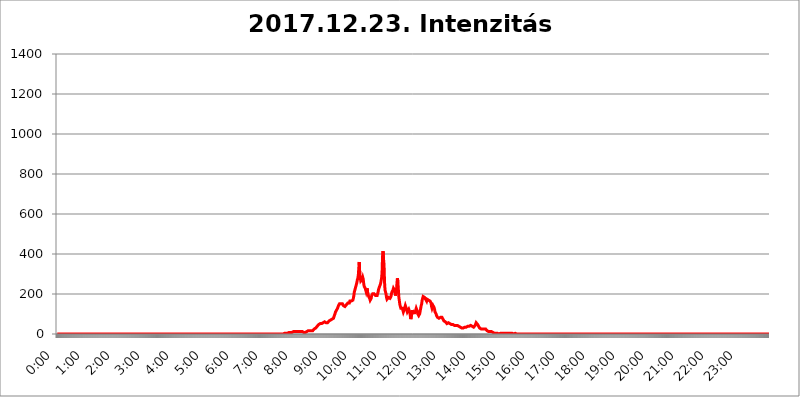
| Category | 2017.12.23. Intenzitás [W/m^2] |
|---|---|
| 0.0 | 0 |
| 0.0006944444444444445 | 0 |
| 0.001388888888888889 | 0 |
| 0.0020833333333333333 | 0 |
| 0.002777777777777778 | 0 |
| 0.003472222222222222 | 0 |
| 0.004166666666666667 | 0 |
| 0.004861111111111111 | 0 |
| 0.005555555555555556 | 0 |
| 0.0062499999999999995 | 0 |
| 0.006944444444444444 | 0 |
| 0.007638888888888889 | 0 |
| 0.008333333333333333 | 0 |
| 0.009027777777777779 | 0 |
| 0.009722222222222222 | 0 |
| 0.010416666666666666 | 0 |
| 0.011111111111111112 | 0 |
| 0.011805555555555555 | 0 |
| 0.012499999999999999 | 0 |
| 0.013194444444444444 | 0 |
| 0.013888888888888888 | 0 |
| 0.014583333333333332 | 0 |
| 0.015277777777777777 | 0 |
| 0.015972222222222224 | 0 |
| 0.016666666666666666 | 0 |
| 0.017361111111111112 | 0 |
| 0.018055555555555557 | 0 |
| 0.01875 | 0 |
| 0.019444444444444445 | 0 |
| 0.02013888888888889 | 0 |
| 0.020833333333333332 | 0 |
| 0.02152777777777778 | 0 |
| 0.022222222222222223 | 0 |
| 0.02291666666666667 | 0 |
| 0.02361111111111111 | 0 |
| 0.024305555555555556 | 0 |
| 0.024999999999999998 | 0 |
| 0.025694444444444447 | 0 |
| 0.02638888888888889 | 0 |
| 0.027083333333333334 | 0 |
| 0.027777777777777776 | 0 |
| 0.02847222222222222 | 0 |
| 0.029166666666666664 | 0 |
| 0.029861111111111113 | 0 |
| 0.030555555555555555 | 0 |
| 0.03125 | 0 |
| 0.03194444444444445 | 0 |
| 0.03263888888888889 | 0 |
| 0.03333333333333333 | 0 |
| 0.034027777777777775 | 0 |
| 0.034722222222222224 | 0 |
| 0.035416666666666666 | 0 |
| 0.036111111111111115 | 0 |
| 0.03680555555555556 | 0 |
| 0.0375 | 0 |
| 0.03819444444444444 | 0 |
| 0.03888888888888889 | 0 |
| 0.03958333333333333 | 0 |
| 0.04027777777777778 | 0 |
| 0.04097222222222222 | 0 |
| 0.041666666666666664 | 0 |
| 0.042361111111111106 | 0 |
| 0.04305555555555556 | 0 |
| 0.043750000000000004 | 0 |
| 0.044444444444444446 | 0 |
| 0.04513888888888889 | 0 |
| 0.04583333333333334 | 0 |
| 0.04652777777777778 | 0 |
| 0.04722222222222222 | 0 |
| 0.04791666666666666 | 0 |
| 0.04861111111111111 | 0 |
| 0.049305555555555554 | 0 |
| 0.049999999999999996 | 0 |
| 0.05069444444444445 | 0 |
| 0.051388888888888894 | 0 |
| 0.052083333333333336 | 0 |
| 0.05277777777777778 | 0 |
| 0.05347222222222222 | 0 |
| 0.05416666666666667 | 0 |
| 0.05486111111111111 | 0 |
| 0.05555555555555555 | 0 |
| 0.05625 | 0 |
| 0.05694444444444444 | 0 |
| 0.057638888888888885 | 0 |
| 0.05833333333333333 | 0 |
| 0.05902777777777778 | 0 |
| 0.059722222222222225 | 0 |
| 0.06041666666666667 | 0 |
| 0.061111111111111116 | 0 |
| 0.06180555555555556 | 0 |
| 0.0625 | 0 |
| 0.06319444444444444 | 0 |
| 0.06388888888888888 | 0 |
| 0.06458333333333334 | 0 |
| 0.06527777777777778 | 0 |
| 0.06597222222222222 | 0 |
| 0.06666666666666667 | 0 |
| 0.06736111111111111 | 0 |
| 0.06805555555555555 | 0 |
| 0.06874999999999999 | 0 |
| 0.06944444444444443 | 0 |
| 0.07013888888888889 | 0 |
| 0.07083333333333333 | 0 |
| 0.07152777777777779 | 0 |
| 0.07222222222222223 | 0 |
| 0.07291666666666667 | 0 |
| 0.07361111111111111 | 0 |
| 0.07430555555555556 | 0 |
| 0.075 | 0 |
| 0.07569444444444444 | 0 |
| 0.0763888888888889 | 0 |
| 0.07708333333333334 | 0 |
| 0.07777777777777778 | 0 |
| 0.07847222222222222 | 0 |
| 0.07916666666666666 | 0 |
| 0.0798611111111111 | 0 |
| 0.08055555555555556 | 0 |
| 0.08125 | 0 |
| 0.08194444444444444 | 0 |
| 0.08263888888888889 | 0 |
| 0.08333333333333333 | 0 |
| 0.08402777777777777 | 0 |
| 0.08472222222222221 | 0 |
| 0.08541666666666665 | 0 |
| 0.08611111111111112 | 0 |
| 0.08680555555555557 | 0 |
| 0.08750000000000001 | 0 |
| 0.08819444444444445 | 0 |
| 0.08888888888888889 | 0 |
| 0.08958333333333333 | 0 |
| 0.09027777777777778 | 0 |
| 0.09097222222222222 | 0 |
| 0.09166666666666667 | 0 |
| 0.09236111111111112 | 0 |
| 0.09305555555555556 | 0 |
| 0.09375 | 0 |
| 0.09444444444444444 | 0 |
| 0.09513888888888888 | 0 |
| 0.09583333333333333 | 0 |
| 0.09652777777777777 | 0 |
| 0.09722222222222222 | 0 |
| 0.09791666666666667 | 0 |
| 0.09861111111111111 | 0 |
| 0.09930555555555555 | 0 |
| 0.09999999999999999 | 0 |
| 0.10069444444444443 | 0 |
| 0.1013888888888889 | 0 |
| 0.10208333333333335 | 0 |
| 0.10277777777777779 | 0 |
| 0.10347222222222223 | 0 |
| 0.10416666666666667 | 0 |
| 0.10486111111111111 | 0 |
| 0.10555555555555556 | 0 |
| 0.10625 | 0 |
| 0.10694444444444444 | 0 |
| 0.1076388888888889 | 0 |
| 0.10833333333333334 | 0 |
| 0.10902777777777778 | 0 |
| 0.10972222222222222 | 0 |
| 0.1111111111111111 | 0 |
| 0.11180555555555556 | 0 |
| 0.11180555555555556 | 0 |
| 0.1125 | 0 |
| 0.11319444444444444 | 0 |
| 0.11388888888888889 | 0 |
| 0.11458333333333333 | 0 |
| 0.11527777777777777 | 0 |
| 0.11597222222222221 | 0 |
| 0.11666666666666665 | 0 |
| 0.1173611111111111 | 0 |
| 0.11805555555555557 | 0 |
| 0.11944444444444445 | 0 |
| 0.12013888888888889 | 0 |
| 0.12083333333333333 | 0 |
| 0.12152777777777778 | 0 |
| 0.12222222222222223 | 0 |
| 0.12291666666666667 | 0 |
| 0.12291666666666667 | 0 |
| 0.12361111111111112 | 0 |
| 0.12430555555555556 | 0 |
| 0.125 | 0 |
| 0.12569444444444444 | 0 |
| 0.12638888888888888 | 0 |
| 0.12708333333333333 | 0 |
| 0.16875 | 0 |
| 0.12847222222222224 | 0 |
| 0.12916666666666668 | 0 |
| 0.12986111111111112 | 0 |
| 0.13055555555555556 | 0 |
| 0.13125 | 0 |
| 0.13194444444444445 | 0 |
| 0.1326388888888889 | 0 |
| 0.13333333333333333 | 0 |
| 0.13402777777777777 | 0 |
| 0.13402777777777777 | 0 |
| 0.13472222222222222 | 0 |
| 0.13541666666666666 | 0 |
| 0.1361111111111111 | 0 |
| 0.13749999999999998 | 0 |
| 0.13819444444444443 | 0 |
| 0.1388888888888889 | 0 |
| 0.13958333333333334 | 0 |
| 0.14027777777777778 | 0 |
| 0.14097222222222222 | 0 |
| 0.14166666666666666 | 0 |
| 0.1423611111111111 | 0 |
| 0.14305555555555557 | 0 |
| 0.14375000000000002 | 0 |
| 0.14444444444444446 | 0 |
| 0.1451388888888889 | 0 |
| 0.1451388888888889 | 0 |
| 0.14652777777777778 | 0 |
| 0.14722222222222223 | 0 |
| 0.14791666666666667 | 0 |
| 0.1486111111111111 | 0 |
| 0.14930555555555555 | 0 |
| 0.15 | 0 |
| 0.15069444444444444 | 0 |
| 0.15138888888888888 | 0 |
| 0.15208333333333332 | 0 |
| 0.15277777777777776 | 0 |
| 0.15347222222222223 | 0 |
| 0.15416666666666667 | 0 |
| 0.15486111111111112 | 0 |
| 0.15555555555555556 | 0 |
| 0.15625 | 0 |
| 0.15694444444444444 | 0 |
| 0.15763888888888888 | 0 |
| 0.15833333333333333 | 0 |
| 0.15902777777777777 | 0 |
| 0.15972222222222224 | 0 |
| 0.16041666666666668 | 0 |
| 0.16111111111111112 | 0 |
| 0.16180555555555556 | 0 |
| 0.1625 | 0 |
| 0.16319444444444445 | 0 |
| 0.1638888888888889 | 0 |
| 0.16458333333333333 | 0 |
| 0.16527777777777777 | 0 |
| 0.16597222222222222 | 0 |
| 0.16666666666666666 | 0 |
| 0.1673611111111111 | 0 |
| 0.16805555555555554 | 0 |
| 0.16874999999999998 | 0 |
| 0.16944444444444443 | 0 |
| 0.17013888888888887 | 0 |
| 0.1708333333333333 | 0 |
| 0.17152777777777775 | 0 |
| 0.17222222222222225 | 0 |
| 0.1729166666666667 | 0 |
| 0.17361111111111113 | 0 |
| 0.17430555555555557 | 0 |
| 0.17500000000000002 | 0 |
| 0.17569444444444446 | 0 |
| 0.1763888888888889 | 0 |
| 0.17708333333333334 | 0 |
| 0.17777777777777778 | 0 |
| 0.17847222222222223 | 0 |
| 0.17916666666666667 | 0 |
| 0.1798611111111111 | 0 |
| 0.18055555555555555 | 0 |
| 0.18125 | 0 |
| 0.18194444444444444 | 0 |
| 0.1826388888888889 | 0 |
| 0.18333333333333335 | 0 |
| 0.1840277777777778 | 0 |
| 0.18472222222222223 | 0 |
| 0.18541666666666667 | 0 |
| 0.18611111111111112 | 0 |
| 0.18680555555555556 | 0 |
| 0.1875 | 0 |
| 0.18819444444444444 | 0 |
| 0.18888888888888888 | 0 |
| 0.18958333333333333 | 0 |
| 0.19027777777777777 | 0 |
| 0.1909722222222222 | 0 |
| 0.19166666666666665 | 0 |
| 0.19236111111111112 | 0 |
| 0.19305555555555554 | 0 |
| 0.19375 | 0 |
| 0.19444444444444445 | 0 |
| 0.1951388888888889 | 0 |
| 0.19583333333333333 | 0 |
| 0.19652777777777777 | 0 |
| 0.19722222222222222 | 0 |
| 0.19791666666666666 | 0 |
| 0.1986111111111111 | 0 |
| 0.19930555555555554 | 0 |
| 0.19999999999999998 | 0 |
| 0.20069444444444443 | 0 |
| 0.20138888888888887 | 0 |
| 0.2020833333333333 | 0 |
| 0.2027777777777778 | 0 |
| 0.2034722222222222 | 0 |
| 0.2041666666666667 | 0 |
| 0.20486111111111113 | 0 |
| 0.20555555555555557 | 0 |
| 0.20625000000000002 | 0 |
| 0.20694444444444446 | 0 |
| 0.2076388888888889 | 0 |
| 0.20833333333333334 | 0 |
| 0.20902777777777778 | 0 |
| 0.20972222222222223 | 0 |
| 0.21041666666666667 | 0 |
| 0.2111111111111111 | 0 |
| 0.21180555555555555 | 0 |
| 0.2125 | 0 |
| 0.21319444444444444 | 0 |
| 0.2138888888888889 | 0 |
| 0.21458333333333335 | 0 |
| 0.2152777777777778 | 0 |
| 0.21597222222222223 | 0 |
| 0.21666666666666667 | 0 |
| 0.21736111111111112 | 0 |
| 0.21805555555555556 | 0 |
| 0.21875 | 0 |
| 0.21944444444444444 | 0 |
| 0.22013888888888888 | 0 |
| 0.22083333333333333 | 0 |
| 0.22152777777777777 | 0 |
| 0.2222222222222222 | 0 |
| 0.22291666666666665 | 0 |
| 0.2236111111111111 | 0 |
| 0.22430555555555556 | 0 |
| 0.225 | 0 |
| 0.22569444444444445 | 0 |
| 0.2263888888888889 | 0 |
| 0.22708333333333333 | 0 |
| 0.22777777777777777 | 0 |
| 0.22847222222222222 | 0 |
| 0.22916666666666666 | 0 |
| 0.2298611111111111 | 0 |
| 0.23055555555555554 | 0 |
| 0.23124999999999998 | 0 |
| 0.23194444444444443 | 0 |
| 0.23263888888888887 | 0 |
| 0.2333333333333333 | 0 |
| 0.2340277777777778 | 0 |
| 0.2347222222222222 | 0 |
| 0.2354166666666667 | 0 |
| 0.23611111111111113 | 0 |
| 0.23680555555555557 | 0 |
| 0.23750000000000002 | 0 |
| 0.23819444444444446 | 0 |
| 0.2388888888888889 | 0 |
| 0.23958333333333334 | 0 |
| 0.24027777777777778 | 0 |
| 0.24097222222222223 | 0 |
| 0.24166666666666667 | 0 |
| 0.2423611111111111 | 0 |
| 0.24305555555555555 | 0 |
| 0.24375 | 0 |
| 0.24444444444444446 | 0 |
| 0.24513888888888888 | 0 |
| 0.24583333333333335 | 0 |
| 0.2465277777777778 | 0 |
| 0.24722222222222223 | 0 |
| 0.24791666666666667 | 0 |
| 0.24861111111111112 | 0 |
| 0.24930555555555556 | 0 |
| 0.25 | 0 |
| 0.25069444444444444 | 0 |
| 0.2513888888888889 | 0 |
| 0.2520833333333333 | 0 |
| 0.25277777777777777 | 0 |
| 0.2534722222222222 | 0 |
| 0.25416666666666665 | 0 |
| 0.2548611111111111 | 0 |
| 0.2555555555555556 | 0 |
| 0.25625000000000003 | 0 |
| 0.2569444444444445 | 0 |
| 0.2576388888888889 | 0 |
| 0.25833333333333336 | 0 |
| 0.2590277777777778 | 0 |
| 0.25972222222222224 | 0 |
| 0.2604166666666667 | 0 |
| 0.2611111111111111 | 0 |
| 0.26180555555555557 | 0 |
| 0.2625 | 0 |
| 0.26319444444444445 | 0 |
| 0.2638888888888889 | 0 |
| 0.26458333333333334 | 0 |
| 0.2652777777777778 | 0 |
| 0.2659722222222222 | 0 |
| 0.26666666666666666 | 0 |
| 0.2673611111111111 | 0 |
| 0.26805555555555555 | 0 |
| 0.26875 | 0 |
| 0.26944444444444443 | 0 |
| 0.2701388888888889 | 0 |
| 0.2708333333333333 | 0 |
| 0.27152777777777776 | 0 |
| 0.2722222222222222 | 0 |
| 0.27291666666666664 | 0 |
| 0.2736111111111111 | 0 |
| 0.2743055555555555 | 0 |
| 0.27499999999999997 | 0 |
| 0.27569444444444446 | 0 |
| 0.27638888888888885 | 0 |
| 0.27708333333333335 | 0 |
| 0.2777777777777778 | 0 |
| 0.27847222222222223 | 0 |
| 0.2791666666666667 | 0 |
| 0.2798611111111111 | 0 |
| 0.28055555555555556 | 0 |
| 0.28125 | 0 |
| 0.28194444444444444 | 0 |
| 0.2826388888888889 | 0 |
| 0.2833333333333333 | 0 |
| 0.28402777777777777 | 0 |
| 0.2847222222222222 | 0 |
| 0.28541666666666665 | 0 |
| 0.28611111111111115 | 0 |
| 0.28680555555555554 | 0 |
| 0.28750000000000003 | 0 |
| 0.2881944444444445 | 0 |
| 0.2888888888888889 | 0 |
| 0.28958333333333336 | 0 |
| 0.2902777777777778 | 0 |
| 0.29097222222222224 | 0 |
| 0.2916666666666667 | 0 |
| 0.2923611111111111 | 0 |
| 0.29305555555555557 | 0 |
| 0.29375 | 0 |
| 0.29444444444444445 | 0 |
| 0.2951388888888889 | 0 |
| 0.29583333333333334 | 0 |
| 0.2965277777777778 | 0 |
| 0.2972222222222222 | 0 |
| 0.29791666666666666 | 0 |
| 0.2986111111111111 | 0 |
| 0.29930555555555555 | 0 |
| 0.3 | 0 |
| 0.30069444444444443 | 0 |
| 0.3013888888888889 | 0 |
| 0.3020833333333333 | 0 |
| 0.30277777777777776 | 0 |
| 0.3034722222222222 | 0 |
| 0.30416666666666664 | 0 |
| 0.3048611111111111 | 0 |
| 0.3055555555555555 | 0 |
| 0.30624999999999997 | 0 |
| 0.3069444444444444 | 0 |
| 0.3076388888888889 | 0 |
| 0.30833333333333335 | 0 |
| 0.3090277777777778 | 0 |
| 0.30972222222222223 | 0 |
| 0.3104166666666667 | 0 |
| 0.3111111111111111 | 0 |
| 0.31180555555555556 | 0 |
| 0.3125 | 0 |
| 0.31319444444444444 | 0 |
| 0.3138888888888889 | 0 |
| 0.3145833333333333 | 0 |
| 0.31527777777777777 | 0 |
| 0.3159722222222222 | 0 |
| 0.31666666666666665 | 0 |
| 0.31736111111111115 | 0 |
| 0.31805555555555554 | 0 |
| 0.31875000000000003 | 3.525 |
| 0.3194444444444445 | 3.525 |
| 0.3201388888888889 | 3.525 |
| 0.32083333333333336 | 3.525 |
| 0.3215277777777778 | 3.525 |
| 0.32222222222222224 | 3.525 |
| 0.3229166666666667 | 3.525 |
| 0.3236111111111111 | 3.525 |
| 0.32430555555555557 | 3.525 |
| 0.325 | 7.887 |
| 0.32569444444444445 | 7.887 |
| 0.3263888888888889 | 7.887 |
| 0.32708333333333334 | 7.887 |
| 0.3277777777777778 | 7.887 |
| 0.3284722222222222 | 7.887 |
| 0.32916666666666666 | 7.887 |
| 0.3298611111111111 | 12.257 |
| 0.33055555555555555 | 12.257 |
| 0.33125 | 12.257 |
| 0.33194444444444443 | 12.257 |
| 0.3326388888888889 | 12.257 |
| 0.3333333333333333 | 12.257 |
| 0.3340277777777778 | 12.257 |
| 0.3347222222222222 | 12.257 |
| 0.3354166666666667 | 12.257 |
| 0.3361111111111111 | 7.887 |
| 0.3368055555555556 | 7.887 |
| 0.33749999999999997 | 12.257 |
| 0.33819444444444446 | 12.257 |
| 0.33888888888888885 | 12.257 |
| 0.33958333333333335 | 12.257 |
| 0.34027777777777773 | 12.257 |
| 0.34097222222222223 | 12.257 |
| 0.3416666666666666 | 12.257 |
| 0.3423611111111111 | 12.257 |
| 0.3430555555555555 | 12.257 |
| 0.34375 | 12.257 |
| 0.3444444444444445 | 12.257 |
| 0.3451388888888889 | 7.887 |
| 0.3458333333333334 | 7.887 |
| 0.34652777777777777 | 12.257 |
| 0.34722222222222227 | 12.257 |
| 0.34791666666666665 | 7.887 |
| 0.34861111111111115 | 7.887 |
| 0.34930555555555554 | 12.257 |
| 0.35000000000000003 | 12.257 |
| 0.3506944444444444 | 12.257 |
| 0.3513888888888889 | 12.257 |
| 0.3520833333333333 | 16.636 |
| 0.3527777777777778 | 16.636 |
| 0.3534722222222222 | 16.636 |
| 0.3541666666666667 | 16.636 |
| 0.3548611111111111 | 16.636 |
| 0.35555555555555557 | 16.636 |
| 0.35625 | 16.636 |
| 0.35694444444444445 | 16.636 |
| 0.3576388888888889 | 16.636 |
| 0.35833333333333334 | 16.636 |
| 0.3590277777777778 | 21.024 |
| 0.3597222222222222 | 21.024 |
| 0.36041666666666666 | 25.419 |
| 0.3611111111111111 | 25.419 |
| 0.36180555555555555 | 29.823 |
| 0.3625 | 29.823 |
| 0.36319444444444443 | 34.234 |
| 0.3638888888888889 | 34.234 |
| 0.3645833333333333 | 38.653 |
| 0.3652777777777778 | 38.653 |
| 0.3659722222222222 | 43.079 |
| 0.3666666666666667 | 47.511 |
| 0.3673611111111111 | 47.511 |
| 0.3680555555555556 | 51.951 |
| 0.36874999999999997 | 51.951 |
| 0.36944444444444446 | 51.951 |
| 0.37013888888888885 | 51.951 |
| 0.37083333333333335 | 51.951 |
| 0.37152777777777773 | 51.951 |
| 0.37222222222222223 | 51.951 |
| 0.3729166666666666 | 56.398 |
| 0.3736111111111111 | 56.398 |
| 0.3743055555555555 | 60.85 |
| 0.375 | 60.85 |
| 0.3756944444444445 | 60.85 |
| 0.3763888888888889 | 60.85 |
| 0.3770833333333334 | 56.398 |
| 0.37777777777777777 | 56.398 |
| 0.37847222222222227 | 51.951 |
| 0.37916666666666665 | 56.398 |
| 0.37986111111111115 | 56.398 |
| 0.38055555555555554 | 60.85 |
| 0.38125000000000003 | 65.31 |
| 0.3819444444444444 | 65.31 |
| 0.3826388888888889 | 69.775 |
| 0.3833333333333333 | 69.775 |
| 0.3840277777777778 | 69.775 |
| 0.3847222222222222 | 69.775 |
| 0.3854166666666667 | 74.246 |
| 0.3861111111111111 | 74.246 |
| 0.38680555555555557 | 74.246 |
| 0.3875 | 78.722 |
| 0.38819444444444445 | 87.692 |
| 0.3888888888888889 | 92.184 |
| 0.38958333333333334 | 101.184 |
| 0.3902777777777778 | 110.201 |
| 0.3909722222222222 | 114.716 |
| 0.39166666666666666 | 119.235 |
| 0.3923611111111111 | 123.758 |
| 0.39305555555555555 | 128.284 |
| 0.39375 | 132.814 |
| 0.39444444444444443 | 141.884 |
| 0.3951388888888889 | 146.423 |
| 0.3958333333333333 | 150.964 |
| 0.3965277777777778 | 150.964 |
| 0.3972222222222222 | 155.509 |
| 0.3979166666666667 | 150.964 |
| 0.3986111111111111 | 150.964 |
| 0.3993055555555556 | 155.509 |
| 0.39999999999999997 | 150.964 |
| 0.40069444444444446 | 146.423 |
| 0.40138888888888885 | 141.884 |
| 0.40208333333333335 | 141.884 |
| 0.40277777777777773 | 137.347 |
| 0.40347222222222223 | 137.347 |
| 0.4041666666666666 | 137.347 |
| 0.4048611111111111 | 137.347 |
| 0.4055555555555555 | 146.423 |
| 0.40625 | 150.964 |
| 0.4069444444444445 | 150.964 |
| 0.4076388888888889 | 155.509 |
| 0.4083333333333334 | 150.964 |
| 0.40902777777777777 | 150.964 |
| 0.40972222222222227 | 155.509 |
| 0.41041666666666665 | 164.605 |
| 0.41111111111111115 | 169.156 |
| 0.41180555555555554 | 169.156 |
| 0.41250000000000003 | 164.605 |
| 0.4131944444444444 | 160.056 |
| 0.4138888888888889 | 164.605 |
| 0.4145833333333333 | 169.156 |
| 0.4152777777777778 | 178.264 |
| 0.4159722222222222 | 191.937 |
| 0.4166666666666667 | 210.182 |
| 0.4173611111111111 | 219.309 |
| 0.41805555555555557 | 228.436 |
| 0.41875 | 237.564 |
| 0.41944444444444445 | 246.689 |
| 0.4201388888888889 | 255.813 |
| 0.42083333333333334 | 269.49 |
| 0.4215277777777778 | 278.603 |
| 0.4222222222222222 | 292.259 |
| 0.42291666666666666 | 328.584 |
| 0.4236111111111111 | 360.221 |
| 0.42430555555555555 | 296.808 |
| 0.425 | 278.603 |
| 0.42569444444444443 | 264.932 |
| 0.4263888888888889 | 260.373 |
| 0.4270833333333333 | 269.49 |
| 0.4277777777777778 | 274.047 |
| 0.4284722222222222 | 283.156 |
| 0.4291666666666667 | 274.047 |
| 0.4298611111111111 | 251.251 |
| 0.4305555555555556 | 237.564 |
| 0.43124999999999997 | 233 |
| 0.43194444444444446 | 228.436 |
| 0.43263888888888885 | 219.309 |
| 0.43333333333333335 | 210.182 |
| 0.43402777777777773 | 214.746 |
| 0.43472222222222223 | 228.436 |
| 0.4354166666666666 | 205.62 |
| 0.4361111111111111 | 196.497 |
| 0.4368055555555555 | 187.378 |
| 0.4375 | 182.82 |
| 0.4381944444444445 | 178.264 |
| 0.4388888888888889 | 169.156 |
| 0.4395833333333334 | 169.156 |
| 0.44027777777777777 | 178.264 |
| 0.44097222222222227 | 191.937 |
| 0.44166666666666665 | 196.497 |
| 0.44236111111111115 | 201.058 |
| 0.44305555555555554 | 201.058 |
| 0.44375000000000003 | 201.058 |
| 0.4444444444444444 | 201.058 |
| 0.4451388888888889 | 201.058 |
| 0.4458333333333333 | 196.497 |
| 0.4465277777777778 | 191.937 |
| 0.4472222222222222 | 191.937 |
| 0.4479166666666667 | 191.937 |
| 0.4486111111111111 | 191.937 |
| 0.44930555555555557 | 201.058 |
| 0.45 | 210.182 |
| 0.45069444444444445 | 223.873 |
| 0.4513888888888889 | 228.436 |
| 0.45208333333333334 | 237.564 |
| 0.4527777777777778 | 242.127 |
| 0.4534722222222222 | 251.251 |
| 0.45416666666666666 | 255.813 |
| 0.4548611111111111 | 278.603 |
| 0.45555555555555555 | 305.898 |
| 0.45625 | 387.202 |
| 0.45694444444444443 | 414.035 |
| 0.4576388888888889 | 373.729 |
| 0.4583333333333333 | 346.682 |
| 0.4590277777777778 | 260.373 |
| 0.4597222222222222 | 219.309 |
| 0.4604166666666667 | 210.182 |
| 0.4611111111111111 | 201.058 |
| 0.4618055555555556 | 182.82 |
| 0.46249999999999997 | 173.709 |
| 0.46319444444444446 | 169.156 |
| 0.46388888888888885 | 178.264 |
| 0.46458333333333335 | 182.82 |
| 0.46527777777777773 | 187.378 |
| 0.46597222222222223 | 182.82 |
| 0.4666666666666666 | 178.264 |
| 0.4673611111111111 | 182.82 |
| 0.4680555555555555 | 187.378 |
| 0.46875 | 201.058 |
| 0.4694444444444445 | 210.182 |
| 0.4701388888888889 | 214.746 |
| 0.4708333333333334 | 219.309 |
| 0.47152777777777777 | 228.436 |
| 0.47222222222222227 | 233 |
| 0.47291666666666665 | 233 |
| 0.47361111111111115 | 214.746 |
| 0.47430555555555554 | 191.937 |
| 0.47500000000000003 | 191.937 |
| 0.4756944444444444 | 214.746 |
| 0.4763888888888889 | 251.251 |
| 0.4770833333333333 | 278.603 |
| 0.4777777777777778 | 260.373 |
| 0.4784722222222222 | 219.309 |
| 0.4791666666666667 | 182.82 |
| 0.4798611111111111 | 164.605 |
| 0.48055555555555557 | 146.423 |
| 0.48125 | 137.347 |
| 0.48194444444444445 | 128.284 |
| 0.4826388888888889 | 128.284 |
| 0.48333333333333334 | 128.284 |
| 0.4840277777777778 | 128.284 |
| 0.4847222222222222 | 119.235 |
| 0.48541666666666666 | 110.201 |
| 0.4861111111111111 | 110.201 |
| 0.48680555555555555 | 123.758 |
| 0.4875 | 132.814 |
| 0.48819444444444443 | 141.884 |
| 0.4888888888888889 | 146.423 |
| 0.4895833333333333 | 137.347 |
| 0.4902777777777778 | 119.235 |
| 0.4909722222222222 | 110.201 |
| 0.4916666666666667 | 110.201 |
| 0.4923611111111111 | 114.716 |
| 0.4930555555555556 | 123.758 |
| 0.49374999999999997 | 123.758 |
| 0.49444444444444446 | 110.201 |
| 0.49513888888888885 | 92.184 |
| 0.49583333333333335 | 74.246 |
| 0.49652777777777773 | 74.246 |
| 0.49722222222222223 | 101.184 |
| 0.4979166666666666 | 119.235 |
| 0.4986111111111111 | 114.716 |
| 0.4993055555555555 | 105.69 |
| 0.5 | 101.184 |
| 0.5006944444444444 | 101.184 |
| 0.5013888888888889 | 105.69 |
| 0.5020833333333333 | 110.201 |
| 0.5027777777777778 | 119.235 |
| 0.5034722222222222 | 128.284 |
| 0.5041666666666667 | 128.284 |
| 0.5048611111111111 | 114.716 |
| 0.5055555555555555 | 101.184 |
| 0.50625 | 96.682 |
| 0.5069444444444444 | 92.184 |
| 0.5076388888888889 | 96.682 |
| 0.5083333333333333 | 101.184 |
| 0.5090277777777777 | 114.716 |
| 0.5097222222222222 | 128.284 |
| 0.5104166666666666 | 141.884 |
| 0.5111111111111112 | 150.964 |
| 0.5118055555555555 | 169.156 |
| 0.5125000000000001 | 178.264 |
| 0.5131944444444444 | 187.378 |
| 0.513888888888889 | 187.378 |
| 0.5145833333333333 | 187.378 |
| 0.5152777777777778 | 182.82 |
| 0.5159722222222222 | 187.378 |
| 0.5166666666666667 | 173.709 |
| 0.517361111111111 | 173.709 |
| 0.5180555555555556 | 164.605 |
| 0.5187499999999999 | 173.709 |
| 0.5194444444444445 | 178.264 |
| 0.5201388888888888 | 178.264 |
| 0.5208333333333334 | 169.156 |
| 0.5215277777777778 | 164.605 |
| 0.5222222222222223 | 164.605 |
| 0.5229166666666667 | 164.605 |
| 0.5236111111111111 | 164.605 |
| 0.5243055555555556 | 155.509 |
| 0.525 | 137.347 |
| 0.5256944444444445 | 128.284 |
| 0.5263888888888889 | 132.814 |
| 0.5270833333333333 | 141.884 |
| 0.5277777777777778 | 141.884 |
| 0.5284722222222222 | 132.814 |
| 0.5291666666666667 | 123.758 |
| 0.5298611111111111 | 110.201 |
| 0.5305555555555556 | 105.69 |
| 0.53125 | 101.184 |
| 0.5319444444444444 | 92.184 |
| 0.5326388888888889 | 87.692 |
| 0.5333333333333333 | 83.205 |
| 0.5340277777777778 | 78.722 |
| 0.5347222222222222 | 78.722 |
| 0.5354166666666667 | 78.722 |
| 0.5361111111111111 | 78.722 |
| 0.5368055555555555 | 83.205 |
| 0.5375 | 83.205 |
| 0.5381944444444444 | 83.205 |
| 0.5388888888888889 | 83.205 |
| 0.5395833333333333 | 83.205 |
| 0.5402777777777777 | 78.722 |
| 0.5409722222222222 | 74.246 |
| 0.5416666666666666 | 69.775 |
| 0.5423611111111112 | 65.31 |
| 0.5430555555555555 | 65.31 |
| 0.5437500000000001 | 65.31 |
| 0.5444444444444444 | 60.85 |
| 0.545138888888889 | 56.398 |
| 0.5458333333333333 | 56.398 |
| 0.5465277777777778 | 51.951 |
| 0.5472222222222222 | 51.951 |
| 0.5479166666666667 | 51.951 |
| 0.548611111111111 | 56.398 |
| 0.5493055555555556 | 56.398 |
| 0.5499999999999999 | 51.951 |
| 0.5506944444444445 | 51.951 |
| 0.5513888888888888 | 47.511 |
| 0.5520833333333334 | 47.511 |
| 0.5527777777777778 | 47.511 |
| 0.5534722222222223 | 43.079 |
| 0.5541666666666667 | 47.511 |
| 0.5548611111111111 | 47.511 |
| 0.5555555555555556 | 47.511 |
| 0.55625 | 43.079 |
| 0.5569444444444445 | 43.079 |
| 0.5576388888888889 | 43.079 |
| 0.5583333333333333 | 43.079 |
| 0.5590277777777778 | 43.079 |
| 0.5597222222222222 | 43.079 |
| 0.5604166666666667 | 43.079 |
| 0.5611111111111111 | 43.079 |
| 0.5618055555555556 | 38.653 |
| 0.5625 | 38.653 |
| 0.5631944444444444 | 38.653 |
| 0.5638888888888889 | 34.234 |
| 0.5645833333333333 | 34.234 |
| 0.5652777777777778 | 34.234 |
| 0.5659722222222222 | 29.823 |
| 0.5666666666666667 | 29.823 |
| 0.5673611111111111 | 29.823 |
| 0.5680555555555555 | 29.823 |
| 0.56875 | 29.823 |
| 0.5694444444444444 | 29.823 |
| 0.5701388888888889 | 29.823 |
| 0.5708333333333333 | 29.823 |
| 0.5715277777777777 | 34.234 |
| 0.5722222222222222 | 34.234 |
| 0.5729166666666666 | 34.234 |
| 0.5736111111111112 | 34.234 |
| 0.5743055555555555 | 38.653 |
| 0.5750000000000001 | 38.653 |
| 0.5756944444444444 | 38.653 |
| 0.576388888888889 | 38.653 |
| 0.5770833333333333 | 38.653 |
| 0.5777777777777778 | 38.653 |
| 0.5784722222222222 | 38.653 |
| 0.5791666666666667 | 38.653 |
| 0.579861111111111 | 43.079 |
| 0.5805555555555556 | 43.079 |
| 0.5812499999999999 | 38.653 |
| 0.5819444444444445 | 38.653 |
| 0.5826388888888888 | 38.653 |
| 0.5833333333333334 | 38.653 |
| 0.5840277777777778 | 34.234 |
| 0.5847222222222223 | 38.653 |
| 0.5854166666666667 | 34.234 |
| 0.5861111111111111 | 43.079 |
| 0.5868055555555556 | 47.511 |
| 0.5875 | 56.398 |
| 0.5881944444444445 | 56.398 |
| 0.5888888888888889 | 51.951 |
| 0.5895833333333333 | 47.511 |
| 0.5902777777777778 | 43.079 |
| 0.5909722222222222 | 38.653 |
| 0.5916666666666667 | 34.234 |
| 0.5923611111111111 | 29.823 |
| 0.5930555555555556 | 29.823 |
| 0.59375 | 29.823 |
| 0.5944444444444444 | 25.419 |
| 0.5951388888888889 | 25.419 |
| 0.5958333333333333 | 25.419 |
| 0.5965277777777778 | 25.419 |
| 0.5972222222222222 | 25.419 |
| 0.5979166666666667 | 25.419 |
| 0.5986111111111111 | 25.419 |
| 0.5993055555555555 | 25.419 |
| 0.6 | 25.419 |
| 0.6006944444444444 | 25.419 |
| 0.6013888888888889 | 25.419 |
| 0.6020833333333333 | 21.024 |
| 0.6027777777777777 | 16.636 |
| 0.6034722222222222 | 12.257 |
| 0.6041666666666666 | 12.257 |
| 0.6048611111111112 | 12.257 |
| 0.6055555555555555 | 12.257 |
| 0.6062500000000001 | 12.257 |
| 0.6069444444444444 | 12.257 |
| 0.607638888888889 | 12.257 |
| 0.6083333333333333 | 12.257 |
| 0.6090277777777778 | 12.257 |
| 0.6097222222222222 | 7.887 |
| 0.6104166666666667 | 7.887 |
| 0.611111111111111 | 7.887 |
| 0.6118055555555556 | 7.887 |
| 0.6124999999999999 | 7.887 |
| 0.6131944444444445 | 3.525 |
| 0.6138888888888888 | 3.525 |
| 0.6145833333333334 | 3.525 |
| 0.6152777777777778 | 3.525 |
| 0.6159722222222223 | 3.525 |
| 0.6166666666666667 | 0 |
| 0.6173611111111111 | 3.525 |
| 0.6180555555555556 | 0 |
| 0.61875 | 0 |
| 0.6194444444444445 | 0 |
| 0.6201388888888889 | 3.525 |
| 0.6208333333333333 | 3.525 |
| 0.6215277777777778 | 3.525 |
| 0.6222222222222222 | 3.525 |
| 0.6229166666666667 | 3.525 |
| 0.6236111111111111 | 3.525 |
| 0.6243055555555556 | 3.525 |
| 0.625 | 3.525 |
| 0.6256944444444444 | 3.525 |
| 0.6263888888888889 | 3.525 |
| 0.6270833333333333 | 3.525 |
| 0.6277777777777778 | 3.525 |
| 0.6284722222222222 | 3.525 |
| 0.6291666666666667 | 3.525 |
| 0.6298611111111111 | 3.525 |
| 0.6305555555555555 | 3.525 |
| 0.63125 | 3.525 |
| 0.6319444444444444 | 3.525 |
| 0.6326388888888889 | 3.525 |
| 0.6333333333333333 | 3.525 |
| 0.6340277777777777 | 3.525 |
| 0.6347222222222222 | 3.525 |
| 0.6354166666666666 | 3.525 |
| 0.6361111111111112 | 3.525 |
| 0.6368055555555555 | 3.525 |
| 0.6375000000000001 | 3.525 |
| 0.6381944444444444 | 3.525 |
| 0.638888888888889 | 3.525 |
| 0.6395833333333333 | 3.525 |
| 0.6402777777777778 | 0 |
| 0.6409722222222222 | 3.525 |
| 0.6416666666666667 | 3.525 |
| 0.642361111111111 | 3.525 |
| 0.6430555555555556 | 0 |
| 0.6437499999999999 | 0 |
| 0.6444444444444445 | 0 |
| 0.6451388888888888 | 0 |
| 0.6458333333333334 | 0 |
| 0.6465277777777778 | 0 |
| 0.6472222222222223 | 0 |
| 0.6479166666666667 | 0 |
| 0.6486111111111111 | 0 |
| 0.6493055555555556 | 0 |
| 0.65 | 0 |
| 0.6506944444444445 | 0 |
| 0.6513888888888889 | 0 |
| 0.6520833333333333 | 0 |
| 0.6527777777777778 | 0 |
| 0.6534722222222222 | 0 |
| 0.6541666666666667 | 0 |
| 0.6548611111111111 | 0 |
| 0.6555555555555556 | 0 |
| 0.65625 | 0 |
| 0.6569444444444444 | 0 |
| 0.6576388888888889 | 0 |
| 0.6583333333333333 | 0 |
| 0.6590277777777778 | 0 |
| 0.6597222222222222 | 0 |
| 0.6604166666666667 | 0 |
| 0.6611111111111111 | 0 |
| 0.6618055555555555 | 0 |
| 0.6625 | 0 |
| 0.6631944444444444 | 0 |
| 0.6638888888888889 | 0 |
| 0.6645833333333333 | 0 |
| 0.6652777777777777 | 0 |
| 0.6659722222222222 | 0 |
| 0.6666666666666666 | 0 |
| 0.6673611111111111 | 0 |
| 0.6680555555555556 | 0 |
| 0.6687500000000001 | 0 |
| 0.6694444444444444 | 0 |
| 0.6701388888888888 | 0 |
| 0.6708333333333334 | 0 |
| 0.6715277777777778 | 0 |
| 0.6722222222222222 | 0 |
| 0.6729166666666666 | 0 |
| 0.6736111111111112 | 0 |
| 0.6743055555555556 | 0 |
| 0.6749999999999999 | 0 |
| 0.6756944444444444 | 0 |
| 0.6763888888888889 | 0 |
| 0.6770833333333334 | 0 |
| 0.6777777777777777 | 0 |
| 0.6784722222222223 | 0 |
| 0.6791666666666667 | 0 |
| 0.6798611111111111 | 0 |
| 0.6805555555555555 | 0 |
| 0.68125 | 0 |
| 0.6819444444444445 | 0 |
| 0.6826388888888889 | 0 |
| 0.6833333333333332 | 0 |
| 0.6840277777777778 | 0 |
| 0.6847222222222222 | 0 |
| 0.6854166666666667 | 0 |
| 0.686111111111111 | 0 |
| 0.6868055555555556 | 0 |
| 0.6875 | 0 |
| 0.6881944444444444 | 0 |
| 0.688888888888889 | 0 |
| 0.6895833333333333 | 0 |
| 0.6902777777777778 | 0 |
| 0.6909722222222222 | 0 |
| 0.6916666666666668 | 0 |
| 0.6923611111111111 | 0 |
| 0.6930555555555555 | 0 |
| 0.69375 | 0 |
| 0.6944444444444445 | 0 |
| 0.6951388888888889 | 0 |
| 0.6958333333333333 | 0 |
| 0.6965277777777777 | 0 |
| 0.6972222222222223 | 0 |
| 0.6979166666666666 | 0 |
| 0.6986111111111111 | 0 |
| 0.6993055555555556 | 0 |
| 0.7000000000000001 | 0 |
| 0.7006944444444444 | 0 |
| 0.7013888888888888 | 0 |
| 0.7020833333333334 | 0 |
| 0.7027777777777778 | 0 |
| 0.7034722222222222 | 0 |
| 0.7041666666666666 | 0 |
| 0.7048611111111112 | 0 |
| 0.7055555555555556 | 0 |
| 0.7062499999999999 | 0 |
| 0.7069444444444444 | 0 |
| 0.7076388888888889 | 0 |
| 0.7083333333333334 | 0 |
| 0.7090277777777777 | 0 |
| 0.7097222222222223 | 0 |
| 0.7104166666666667 | 0 |
| 0.7111111111111111 | 0 |
| 0.7118055555555555 | 0 |
| 0.7125 | 0 |
| 0.7131944444444445 | 0 |
| 0.7138888888888889 | 0 |
| 0.7145833333333332 | 0 |
| 0.7152777777777778 | 0 |
| 0.7159722222222222 | 0 |
| 0.7166666666666667 | 0 |
| 0.717361111111111 | 0 |
| 0.7180555555555556 | 0 |
| 0.71875 | 0 |
| 0.7194444444444444 | 0 |
| 0.720138888888889 | 0 |
| 0.7208333333333333 | 0 |
| 0.7215277777777778 | 0 |
| 0.7222222222222222 | 0 |
| 0.7229166666666668 | 0 |
| 0.7236111111111111 | 0 |
| 0.7243055555555555 | 0 |
| 0.725 | 0 |
| 0.7256944444444445 | 0 |
| 0.7263888888888889 | 0 |
| 0.7270833333333333 | 0 |
| 0.7277777777777777 | 0 |
| 0.7284722222222223 | 0 |
| 0.7291666666666666 | 0 |
| 0.7298611111111111 | 0 |
| 0.7305555555555556 | 0 |
| 0.7312500000000001 | 0 |
| 0.7319444444444444 | 0 |
| 0.7326388888888888 | 0 |
| 0.7333333333333334 | 0 |
| 0.7340277777777778 | 0 |
| 0.7347222222222222 | 0 |
| 0.7354166666666666 | 0 |
| 0.7361111111111112 | 0 |
| 0.7368055555555556 | 0 |
| 0.7374999999999999 | 0 |
| 0.7381944444444444 | 0 |
| 0.7388888888888889 | 0 |
| 0.7395833333333334 | 0 |
| 0.7402777777777777 | 0 |
| 0.7409722222222223 | 0 |
| 0.7416666666666667 | 0 |
| 0.7423611111111111 | 0 |
| 0.7430555555555555 | 0 |
| 0.74375 | 0 |
| 0.7444444444444445 | 0 |
| 0.7451388888888889 | 0 |
| 0.7458333333333332 | 0 |
| 0.7465277777777778 | 0 |
| 0.7472222222222222 | 0 |
| 0.7479166666666667 | 0 |
| 0.748611111111111 | 0 |
| 0.7493055555555556 | 0 |
| 0.75 | 0 |
| 0.7506944444444444 | 0 |
| 0.751388888888889 | 0 |
| 0.7520833333333333 | 0 |
| 0.7527777777777778 | 0 |
| 0.7534722222222222 | 0 |
| 0.7541666666666668 | 0 |
| 0.7548611111111111 | 0 |
| 0.7555555555555555 | 0 |
| 0.75625 | 0 |
| 0.7569444444444445 | 0 |
| 0.7576388888888889 | 0 |
| 0.7583333333333333 | 0 |
| 0.7590277777777777 | 0 |
| 0.7597222222222223 | 0 |
| 0.7604166666666666 | 0 |
| 0.7611111111111111 | 0 |
| 0.7618055555555556 | 0 |
| 0.7625000000000001 | 0 |
| 0.7631944444444444 | 0 |
| 0.7638888888888888 | 0 |
| 0.7645833333333334 | 0 |
| 0.7652777777777778 | 0 |
| 0.7659722222222222 | 0 |
| 0.7666666666666666 | 0 |
| 0.7673611111111112 | 0 |
| 0.7680555555555556 | 0 |
| 0.7687499999999999 | 0 |
| 0.7694444444444444 | 0 |
| 0.7701388888888889 | 0 |
| 0.7708333333333334 | 0 |
| 0.7715277777777777 | 0 |
| 0.7722222222222223 | 0 |
| 0.7729166666666667 | 0 |
| 0.7736111111111111 | 0 |
| 0.7743055555555555 | 0 |
| 0.775 | 0 |
| 0.7756944444444445 | 0 |
| 0.7763888888888889 | 0 |
| 0.7770833333333332 | 0 |
| 0.7777777777777778 | 0 |
| 0.7784722222222222 | 0 |
| 0.7791666666666667 | 0 |
| 0.779861111111111 | 0 |
| 0.7805555555555556 | 0 |
| 0.78125 | 0 |
| 0.7819444444444444 | 0 |
| 0.782638888888889 | 0 |
| 0.7833333333333333 | 0 |
| 0.7840277777777778 | 0 |
| 0.7847222222222222 | 0 |
| 0.7854166666666668 | 0 |
| 0.7861111111111111 | 0 |
| 0.7868055555555555 | 0 |
| 0.7875 | 0 |
| 0.7881944444444445 | 0 |
| 0.7888888888888889 | 0 |
| 0.7895833333333333 | 0 |
| 0.7902777777777777 | 0 |
| 0.7909722222222223 | 0 |
| 0.7916666666666666 | 0 |
| 0.7923611111111111 | 0 |
| 0.7930555555555556 | 0 |
| 0.7937500000000001 | 0 |
| 0.7944444444444444 | 0 |
| 0.7951388888888888 | 0 |
| 0.7958333333333334 | 0 |
| 0.7965277777777778 | 0 |
| 0.7972222222222222 | 0 |
| 0.7979166666666666 | 0 |
| 0.7986111111111112 | 0 |
| 0.7993055555555556 | 0 |
| 0.7999999999999999 | 0 |
| 0.8006944444444444 | 0 |
| 0.8013888888888889 | 0 |
| 0.8020833333333334 | 0 |
| 0.8027777777777777 | 0 |
| 0.8034722222222223 | 0 |
| 0.8041666666666667 | 0 |
| 0.8048611111111111 | 0 |
| 0.8055555555555555 | 0 |
| 0.80625 | 0 |
| 0.8069444444444445 | 0 |
| 0.8076388888888889 | 0 |
| 0.8083333333333332 | 0 |
| 0.8090277777777778 | 0 |
| 0.8097222222222222 | 0 |
| 0.8104166666666667 | 0 |
| 0.811111111111111 | 0 |
| 0.8118055555555556 | 0 |
| 0.8125 | 0 |
| 0.8131944444444444 | 0 |
| 0.813888888888889 | 0 |
| 0.8145833333333333 | 0 |
| 0.8152777777777778 | 0 |
| 0.8159722222222222 | 0 |
| 0.8166666666666668 | 0 |
| 0.8173611111111111 | 0 |
| 0.8180555555555555 | 0 |
| 0.81875 | 0 |
| 0.8194444444444445 | 0 |
| 0.8201388888888889 | 0 |
| 0.8208333333333333 | 0 |
| 0.8215277777777777 | 0 |
| 0.8222222222222223 | 0 |
| 0.8229166666666666 | 0 |
| 0.8236111111111111 | 0 |
| 0.8243055555555556 | 0 |
| 0.8250000000000001 | 0 |
| 0.8256944444444444 | 0 |
| 0.8263888888888888 | 0 |
| 0.8270833333333334 | 0 |
| 0.8277777777777778 | 0 |
| 0.8284722222222222 | 0 |
| 0.8291666666666666 | 0 |
| 0.8298611111111112 | 0 |
| 0.8305555555555556 | 0 |
| 0.8312499999999999 | 0 |
| 0.8319444444444444 | 0 |
| 0.8326388888888889 | 0 |
| 0.8333333333333334 | 0 |
| 0.8340277777777777 | 0 |
| 0.8347222222222223 | 0 |
| 0.8354166666666667 | 0 |
| 0.8361111111111111 | 0 |
| 0.8368055555555555 | 0 |
| 0.8375 | 0 |
| 0.8381944444444445 | 0 |
| 0.8388888888888889 | 0 |
| 0.8395833333333332 | 0 |
| 0.8402777777777778 | 0 |
| 0.8409722222222222 | 0 |
| 0.8416666666666667 | 0 |
| 0.842361111111111 | 0 |
| 0.8430555555555556 | 0 |
| 0.84375 | 0 |
| 0.8444444444444444 | 0 |
| 0.845138888888889 | 0 |
| 0.8458333333333333 | 0 |
| 0.8465277777777778 | 0 |
| 0.8472222222222222 | 0 |
| 0.8479166666666668 | 0 |
| 0.8486111111111111 | 0 |
| 0.8493055555555555 | 0 |
| 0.85 | 0 |
| 0.8506944444444445 | 0 |
| 0.8513888888888889 | 0 |
| 0.8520833333333333 | 0 |
| 0.8527777777777777 | 0 |
| 0.8534722222222223 | 0 |
| 0.8541666666666666 | 0 |
| 0.8548611111111111 | 0 |
| 0.8555555555555556 | 0 |
| 0.8562500000000001 | 0 |
| 0.8569444444444444 | 0 |
| 0.8576388888888888 | 0 |
| 0.8583333333333334 | 0 |
| 0.8590277777777778 | 0 |
| 0.8597222222222222 | 0 |
| 0.8604166666666666 | 0 |
| 0.8611111111111112 | 0 |
| 0.8618055555555556 | 0 |
| 0.8624999999999999 | 0 |
| 0.8631944444444444 | 0 |
| 0.8638888888888889 | 0 |
| 0.8645833333333334 | 0 |
| 0.8652777777777777 | 0 |
| 0.8659722222222223 | 0 |
| 0.8666666666666667 | 0 |
| 0.8673611111111111 | 0 |
| 0.8680555555555555 | 0 |
| 0.86875 | 0 |
| 0.8694444444444445 | 0 |
| 0.8701388888888889 | 0 |
| 0.8708333333333332 | 0 |
| 0.8715277777777778 | 0 |
| 0.8722222222222222 | 0 |
| 0.8729166666666667 | 0 |
| 0.873611111111111 | 0 |
| 0.8743055555555556 | 0 |
| 0.875 | 0 |
| 0.8756944444444444 | 0 |
| 0.876388888888889 | 0 |
| 0.8770833333333333 | 0 |
| 0.8777777777777778 | 0 |
| 0.8784722222222222 | 0 |
| 0.8791666666666668 | 0 |
| 0.8798611111111111 | 0 |
| 0.8805555555555555 | 0 |
| 0.88125 | 0 |
| 0.8819444444444445 | 0 |
| 0.8826388888888889 | 0 |
| 0.8833333333333333 | 0 |
| 0.8840277777777777 | 0 |
| 0.8847222222222223 | 0 |
| 0.8854166666666666 | 0 |
| 0.8861111111111111 | 0 |
| 0.8868055555555556 | 0 |
| 0.8875000000000001 | 0 |
| 0.8881944444444444 | 0 |
| 0.8888888888888888 | 0 |
| 0.8895833333333334 | 0 |
| 0.8902777777777778 | 0 |
| 0.8909722222222222 | 0 |
| 0.8916666666666666 | 0 |
| 0.8923611111111112 | 0 |
| 0.8930555555555556 | 0 |
| 0.8937499999999999 | 0 |
| 0.8944444444444444 | 0 |
| 0.8951388888888889 | 0 |
| 0.8958333333333334 | 0 |
| 0.8965277777777777 | 0 |
| 0.8972222222222223 | 0 |
| 0.8979166666666667 | 0 |
| 0.8986111111111111 | 0 |
| 0.8993055555555555 | 0 |
| 0.9 | 0 |
| 0.9006944444444445 | 0 |
| 0.9013888888888889 | 0 |
| 0.9020833333333332 | 0 |
| 0.9027777777777778 | 0 |
| 0.9034722222222222 | 0 |
| 0.9041666666666667 | 0 |
| 0.904861111111111 | 0 |
| 0.9055555555555556 | 0 |
| 0.90625 | 0 |
| 0.9069444444444444 | 0 |
| 0.907638888888889 | 0 |
| 0.9083333333333333 | 0 |
| 0.9090277777777778 | 0 |
| 0.9097222222222222 | 0 |
| 0.9104166666666668 | 0 |
| 0.9111111111111111 | 0 |
| 0.9118055555555555 | 0 |
| 0.9125 | 0 |
| 0.9131944444444445 | 0 |
| 0.9138888888888889 | 0 |
| 0.9145833333333333 | 0 |
| 0.9152777777777777 | 0 |
| 0.9159722222222223 | 0 |
| 0.9166666666666666 | 0 |
| 0.9173611111111111 | 0 |
| 0.9180555555555556 | 0 |
| 0.9187500000000001 | 0 |
| 0.9194444444444444 | 0 |
| 0.9201388888888888 | 0 |
| 0.9208333333333334 | 0 |
| 0.9215277777777778 | 0 |
| 0.9222222222222222 | 0 |
| 0.9229166666666666 | 0 |
| 0.9236111111111112 | 0 |
| 0.9243055555555556 | 0 |
| 0.9249999999999999 | 0 |
| 0.9256944444444444 | 0 |
| 0.9263888888888889 | 0 |
| 0.9270833333333334 | 0 |
| 0.9277777777777777 | 0 |
| 0.9284722222222223 | 0 |
| 0.9291666666666667 | 0 |
| 0.9298611111111111 | 0 |
| 0.9305555555555555 | 0 |
| 0.93125 | 0 |
| 0.9319444444444445 | 0 |
| 0.9326388888888889 | 0 |
| 0.9333333333333332 | 0 |
| 0.9340277777777778 | 0 |
| 0.9347222222222222 | 0 |
| 0.9354166666666667 | 0 |
| 0.936111111111111 | 0 |
| 0.9368055555555556 | 0 |
| 0.9375 | 0 |
| 0.9381944444444444 | 0 |
| 0.938888888888889 | 0 |
| 0.9395833333333333 | 0 |
| 0.9402777777777778 | 0 |
| 0.9409722222222222 | 0 |
| 0.9416666666666668 | 0 |
| 0.9423611111111111 | 0 |
| 0.9430555555555555 | 0 |
| 0.94375 | 0 |
| 0.9444444444444445 | 0 |
| 0.9451388888888889 | 0 |
| 0.9458333333333333 | 0 |
| 0.9465277777777777 | 0 |
| 0.9472222222222223 | 0 |
| 0.9479166666666666 | 0 |
| 0.9486111111111111 | 0 |
| 0.9493055555555556 | 0 |
| 0.9500000000000001 | 0 |
| 0.9506944444444444 | 0 |
| 0.9513888888888888 | 0 |
| 0.9520833333333334 | 0 |
| 0.9527777777777778 | 0 |
| 0.9534722222222222 | 0 |
| 0.9541666666666666 | 0 |
| 0.9548611111111112 | 0 |
| 0.9555555555555556 | 0 |
| 0.9562499999999999 | 0 |
| 0.9569444444444444 | 0 |
| 0.9576388888888889 | 0 |
| 0.9583333333333334 | 0 |
| 0.9590277777777777 | 0 |
| 0.9597222222222223 | 0 |
| 0.9604166666666667 | 0 |
| 0.9611111111111111 | 0 |
| 0.9618055555555555 | 0 |
| 0.9625 | 0 |
| 0.9631944444444445 | 0 |
| 0.9638888888888889 | 0 |
| 0.9645833333333332 | 0 |
| 0.9652777777777778 | 0 |
| 0.9659722222222222 | 0 |
| 0.9666666666666667 | 0 |
| 0.967361111111111 | 0 |
| 0.9680555555555556 | 0 |
| 0.96875 | 0 |
| 0.9694444444444444 | 0 |
| 0.970138888888889 | 0 |
| 0.9708333333333333 | 0 |
| 0.9715277777777778 | 0 |
| 0.9722222222222222 | 0 |
| 0.9729166666666668 | 0 |
| 0.9736111111111111 | 0 |
| 0.9743055555555555 | 0 |
| 0.975 | 0 |
| 0.9756944444444445 | 0 |
| 0.9763888888888889 | 0 |
| 0.9770833333333333 | 0 |
| 0.9777777777777777 | 0 |
| 0.9784722222222223 | 0 |
| 0.9791666666666666 | 0 |
| 0.9798611111111111 | 0 |
| 0.9805555555555556 | 0 |
| 0.9812500000000001 | 0 |
| 0.9819444444444444 | 0 |
| 0.9826388888888888 | 0 |
| 0.9833333333333334 | 0 |
| 0.9840277777777778 | 0 |
| 0.9847222222222222 | 0 |
| 0.9854166666666666 | 0 |
| 0.9861111111111112 | 0 |
| 0.9868055555555556 | 0 |
| 0.9874999999999999 | 0 |
| 0.9881944444444444 | 0 |
| 0.9888888888888889 | 0 |
| 0.9895833333333334 | 0 |
| 0.9902777777777777 | 0 |
| 0.9909722222222223 | 0 |
| 0.9916666666666667 | 0 |
| 0.9923611111111111 | 0 |
| 0.9930555555555555 | 0 |
| 0.99375 | 0 |
| 0.9944444444444445 | 0 |
| 0.9951388888888889 | 0 |
| 0.9958333333333332 | 0 |
| 0.9965277777777778 | 0 |
| 0.9972222222222222 | 0 |
| 0.9979166666666667 | 0 |
| 0.998611111111111 | 0 |
| 0.9993055555555556 | 0 |